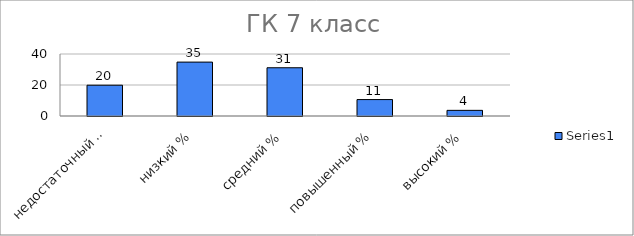
| Category | Series 0 |
|---|---|
| недостаточный % | 19.868 |
| низкий % | 34.768 |
| средний % | 31.126 |
| повышенный % | 10.596 |
| высокий % | 3.642 |